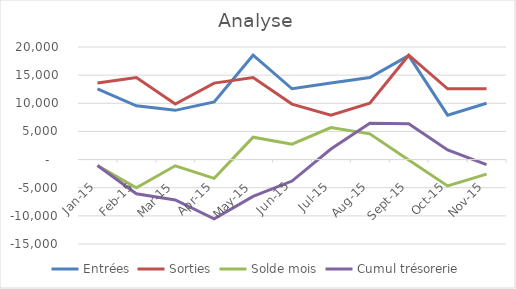
| Category | Entrées | Sorties | Solde mois | Cumul trésorerie |
|---|---|---|---|---|
| 2015-01-01 | 12540 | 13587 | -1047 | -1047 |
| 2015-02-01 | 9542 | 14568 | -5026 | -6073 |
| 2015-03-01 | 8745 | 9854 | -1109 | -7182 |
| 2015-04-01 | 10254 | 13587 | -3333 | -10515 |
| 2015-05-01 | 18542 | 14568 | 3974 | -6541 |
| 2015-06-01 | 12578 | 9854 | 2724 | -3817 |
| 2015-07-01 | 13587 | 7895 | 5692 | 1875 |
| 2015-08-01 | 14568 | 9999 | 4569 | 6444 |
| 2015-09-01 | 18477 | 18542 | -65 | 6379 |
| 2015-10-01 | 7895 | 12578 | -4683 | 1696 |
| 2015-11-01 | 9999 | 12578 | -2579 | -883 |